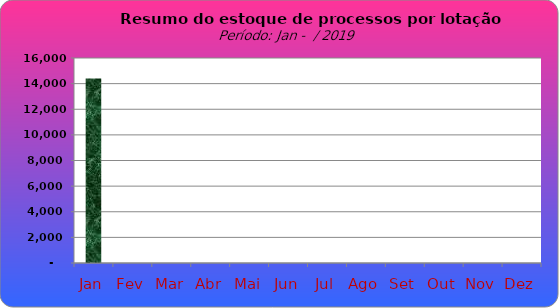
| Category | Series 0 |
|---|---|
| Jan | 14401 |
| Fev | 0 |
| Mar | 0 |
| Abr | 0 |
| Mai | 0 |
| Jun | 0 |
| Jul | 0 |
| Ago | 0 |
| Set | 0 |
| Out | 0 |
| Nov | 0 |
| Dez | 0 |